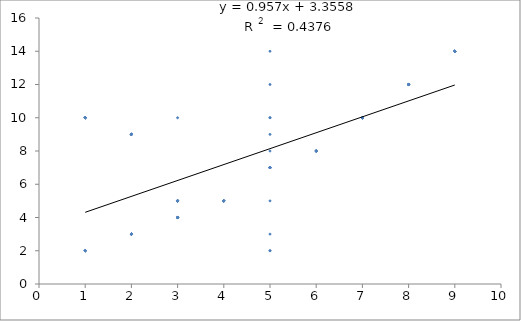
| Category | Series 0 |
|---|---|
| 5.0 | 2 |
| 5.0 | 3 |
| 3.0 | 4 |
| 5.0 | 5 |
| 5.0 | 7 |
| 5.0 | 8 |
| 5.0 | 10 |
| 5.0 | 12 |
| 5.0 | 14 |
| 3.0 | 5 |
| 5.0 | 9 |
| 5.0 | 10 |
| 5.0 | 2 |
| 2.0 | 3 |
| 3.0 | 4 |
| 4.0 | 5 |
| 5.0 | 7 |
| 6.0 | 8 |
| 7.0 | 10 |
| 8.0 | 12 |
| 9.0 | 14 |
| 3.0 | 5 |
| 2.0 | 9 |
| 1.0 | 10 |
| 1.0 | 2 |
| 2.0 | 3 |
| 3.0 | 4 |
| 4.0 | 5 |
| 5.0 | 7 |
| 6.0 | 8 |
| 7.0 | 10 |
| 8.0 | 12 |
| 9.0 | 14 |
| 3.0 | 5 |
| 2.0 | 9 |
| 3.0 | 10 |
| 1.0 | 2 |
| 2.0 | 3 |
| 3.0 | 4 |
| 4.0 | 5 |
| 5.0 | 7 |
| 6.0 | 8 |
| 7.0 | 10 |
| 8.0 | 12 |
| 9.0 | 14 |
| 3.0 | 5 |
| 2.0 | 9 |
| 1.0 | 10 |
| 1.0 | 2 |
| 2.0 | 3 |
| 3.0 | 4 |
| 4.0 | 5 |
| 5.0 | 7 |
| 6.0 | 8 |
| 7.0 | 10 |
| 8.0 | 12 |
| 9.0 | 14 |
| 3.0 | 5 |
| 2.0 | 9 |
| 1.0 | 10 |
| 1.0 | 2 |
| 2.0 | 3 |
| 3.0 | 4 |
| 4.0 | 5 |
| 5.0 | 7 |
| 6.0 | 8 |
| 7.0 | 10 |
| 8.0 | 12 |
| 9.0 | 14 |
| 3.0 | 5 |
| 2.0 | 9 |
| 1.0 | 10 |
| 1.0 | 2 |
| 2.0 | 3 |
| 3.0 | 4 |
| 4.0 | 5 |
| 5.0 | 7 |
| 6.0 | 8 |
| 7.0 | 10 |
| 8.0 | 12 |
| 9.0 | 14 |
| 3.0 | 5 |
| 2.0 | 9 |
| 1.0 | 10 |
| 1.0 | 2 |
| 2.0 | 3 |
| 3.0 | 4 |
| 4.0 | 5 |
| 5.0 | 7 |
| 6.0 | 8 |
| 7.0 | 10 |
| 8.0 | 12 |
| 9.0 | 14 |
| 3.0 | 5 |
| 2.0 | 9 |
| 1.0 | 10 |
| 7.0 | 10 |
| 8.0 | 12 |
| 9.0 | 14 |
| 3.0 | 5 |
| 2.0 | 9 |
| 1.0 | 10 |